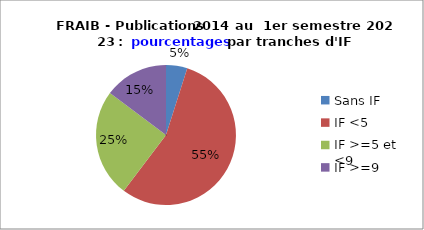
| Category | Series 0 |
|---|---|
| Sans IF | 4.915 |
| IF <5 | 55.382 |
| IF >=5 et <9  | 24.922 |
| IF >=9 | 14.78 |